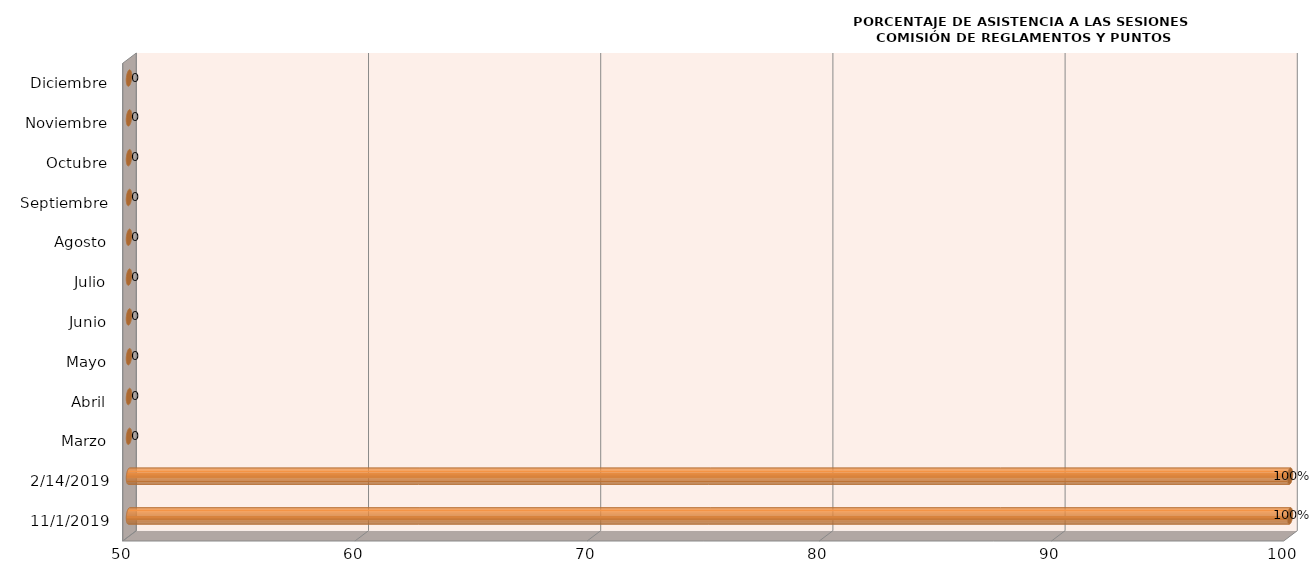
| Category | Series 0 |
|---|---|
| 01/11/2019 | 100 |
| 14/02/2019 | 100 |
| Marzo | 0 |
| Abril | 0 |
| Mayo | 0 |
| Junio | 0 |
| Julio | 0 |
| Agosto | 0 |
| Septiembre | 0 |
| Octubre | 0 |
| Noviembre | 0 |
| Diciembre | 0 |